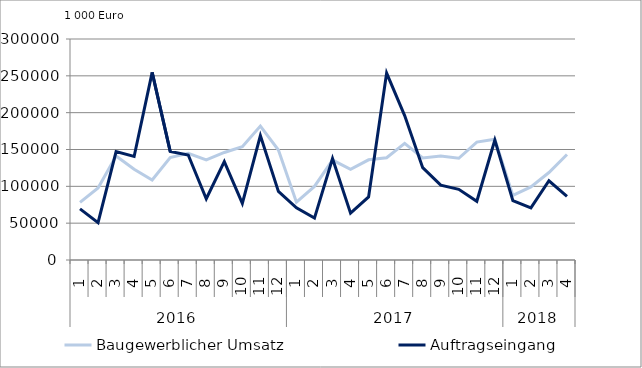
| Category | Baugewerblicher Umsatz | Auftragseingang |
|---|---|---|
| 0 | 78291.738 | 69470.357 |
| 1 | 97863.379 | 50640.033 |
| 2 | 141176.119 | 147206.65 |
| 3 | 123121.297 | 140579.009 |
| 4 | 108561.124 | 254739.334 |
| 5 | 139030.209 | 147481.644 |
| 6 | 144784.416 | 142609.658 |
| 7 | 135870.195 | 83192.156 |
| 8 | 145961.738 | 133594.351 |
| 9 | 153886.826 | 76793.838 |
| 10 | 181740.037 | 168867.568 |
| 11 | 149348.138 | 93011.853 |
| 12 | 78446.78 | 70908.903 |
| 13 | 99841.908 | 56868.408 |
| 14 | 135679.867 | 137790.423 |
| 15 | 123004.403 | 63637.761 |
| 16 | 136010.071 | 85644.63 |
| 17 | 138859.308 | 253791.552 |
| 18 | 158353.879 | 196034.198 |
| 19 | 138510.315 | 125319.873 |
| 20 | 141109.925 | 101690.626 |
| 21 | 138067.098 | 95966.626 |
| 22 | 160064.454 | 79701.993 |
| 23 | 163969.017 | 162878.607 |
| 24 | 87640.529 | 80684.627 |
| 25 | 99259.455 | 70746.763 |
| 26 | 118764.324 | 107538.747 |
| 27 | 143144.178 | 86374.619 |